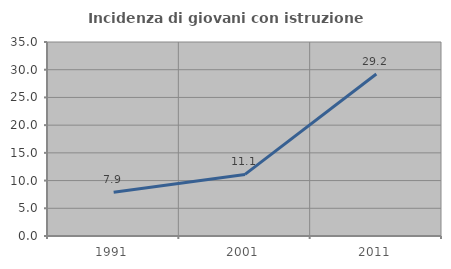
| Category | Incidenza di giovani con istruzione universitaria |
|---|---|
| 1991.0 | 7.895 |
| 2001.0 | 11.111 |
| 2011.0 | 29.231 |